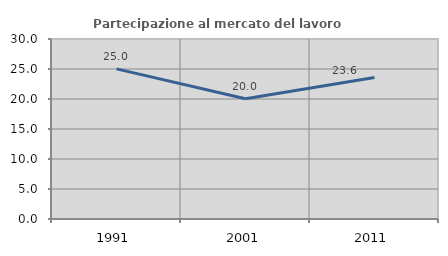
| Category | Partecipazione al mercato del lavoro  femminile |
|---|---|
| 1991.0 | 25.015 |
| 2001.0 | 20.044 |
| 2011.0 | 23.579 |